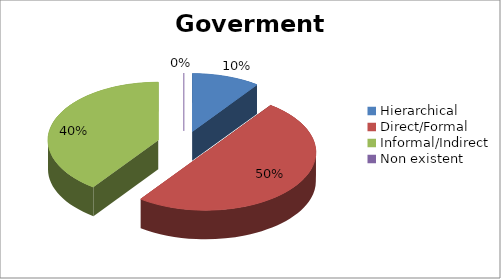
| Category | Series 0 |
|---|---|
| Hierarchical | 2 |
| Direct/Formal | 10 |
| Informal/Indirect | 8 |
| Non existent  | 0 |